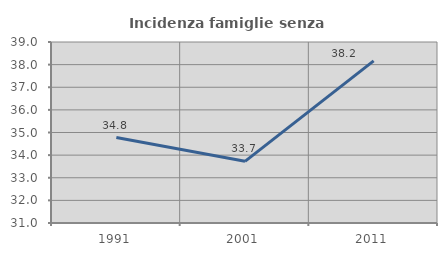
| Category | Incidenza famiglie senza nuclei |
|---|---|
| 1991.0 | 34.776 |
| 2001.0 | 33.726 |
| 2011.0 | 38.164 |